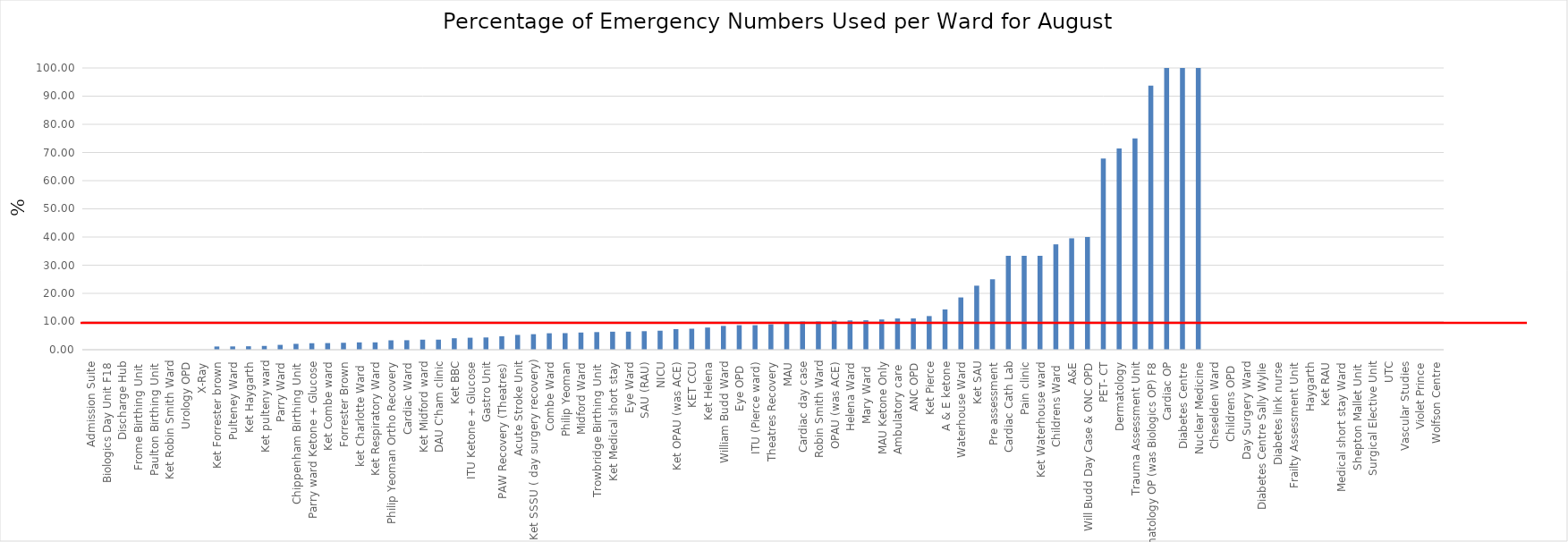
| Category | Series 0 |
|---|---|
| Admission Suite | 0 |
| Biologics Day Unit F18 | 0 |
| Discharge Hub | 0 |
| Frome Birthing Unit  | 0 |
| Paulton Birthing Unit  | 0 |
| Ket Robin Smith Ward | 0 |
| Urology OPD | 0 |
| X-Ray | 0 |
| Ket Forrester brown | 1.141 |
| Pulteney Ward | 1.17 |
| Ket Haygarth | 1.225 |
| Ket pulteny ward | 1.344 |
| Parry Ward | 1.724 |
| Chippenham Birthing Unit  | 2.083 |
| Parry ward Ketone + Glucose | 2.304 |
| Ket Combe ward | 2.353 |
| Forrester Brown | 2.463 |
| ket Charlotte Ward  | 2.602 |
| Ket Respiratory Ward | 2.608 |
| Philip Yeoman Ortho Recovery | 3.333 |
| Cardiac Ward | 3.368 |
| Ket Midford ward | 3.562 |
| DAU C'ham clinic | 3.571 |
| Ket BBC | 4.065 |
| ITU Ketone + Glucose | 4.255 |
| Gastro Unit | 4.348 |
| PAW Recovery (Theatres) | 4.762 |
| Acute Stroke Unit | 5.251 |
| Ket SSSU ( day surgery recovery) | 5.509 |
| Combe Ward | 5.837 |
| Philip Yeoman | 5.882 |
| Midford Ward | 6.098 |
| Trowbridge Birthing Unit  | 6.25 |
| Ket Medical short stay | 6.393 |
| Eye Ward | 6.41 |
| SAU (RAU) | 6.573 |
| NICU | 6.748 |
| Ket OPAU (was ACE) | 7.302 |
| KET CCU | 7.453 |
| Ket Helena | 7.865 |
| William Budd Ward | 8.443 |
| Eye OPD  | 8.696 |
| ITU (Pierce ward) | 8.696 |
| Theatres Recovery | 9.023 |
| MAU | 9.195 |
| Cardiac day case | 10 |
| Robin Smith Ward | 10 |
| OPAU (was ACE) | 10.294 |
| Helena Ward | 10.39 |
| Mary Ward  | 10.442 |
| MAU Ketone Only | 10.734 |
| Ambulatory care  | 11.09 |
| ANC OPD | 11.111 |
| Ket Pierce | 11.942 |
| A & E ketone | 14.286 |
| Waterhouse Ward | 18.554 |
| Ket SAU | 22.727 |
| Pre assessment | 25 |
| Cardiac Cath Lab | 33.333 |
| Pain clinic | 33.333 |
| Ket Waterhouse ward | 33.333 |
| Childrens Ward  | 37.398 |
| A&E | 39.544 |
| Will Budd Day Case & ONC OPD | 40 |
| PET- CT | 67.89 |
| Dermatology | 71.429 |
| Trauma Assessment Unit | 75 |
| Rheumatology OP (was Biologics OP) F8 | 93.75 |
| Cardiac OP | 100 |
| Diabetes Centre | 100 |
| Nuclear Medicine | 100 |
| Cheselden Ward | 0 |
| Childrens OPD  | 0 |
| Day Surgery Ward | 0 |
| Diabetes Centre Sally Wylie | 0 |
| Diabetes link nurse | 0 |
| Frailty Assessment Unit | 0 |
| Haygarth | 0 |
| Ket RAU | 0 |
| Medical short stay Ward | 0 |
| Shepton Mallet Unit  | 0 |
| Surgical Elective Unit | 0 |
| UTC | 0 |
| Vascular Studies | 0 |
| Violet Prince | 0 |
| Wolfson Centre | 0 |